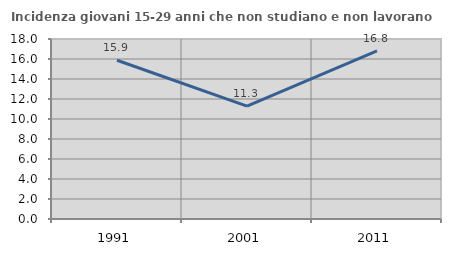
| Category | Incidenza giovani 15-29 anni che non studiano e non lavorano  |
|---|---|
| 1991.0 | 15.873 |
| 2001.0 | 11.282 |
| 2011.0 | 16.822 |